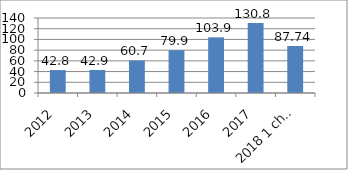
| Category | Series 0 |
|---|---|
| 2012 | 42.8 |
| 2013 | 42.9 |
| 2014 | 60.7 |
| 2015 | 79.9 |
| 2016 | 103.9 |
| 2017 | 130.8 |
| 2018 1 chorak | 87.74 |